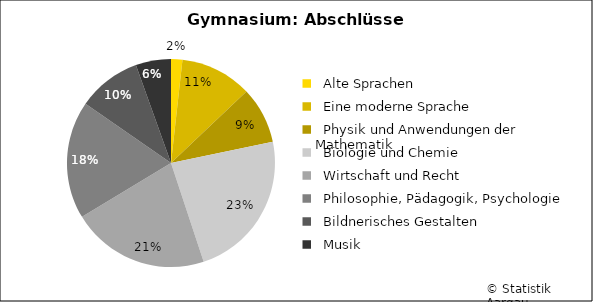
| Category | Series 0 |
|---|---|
|   Alte Sprachen | 18 |
|   Eine moderne Sprache | 114 |
|   Physik und Anwendungen der Mathematik | 90 |
|   Biologie und Chemie | 237 |
|   Wirtschaft und Recht | 219 |
|   Philosophie, Pädagogik, Psychologie | 187 |
|   Bildnerisches Gestalten | 101 |
|   Musik | 56 |